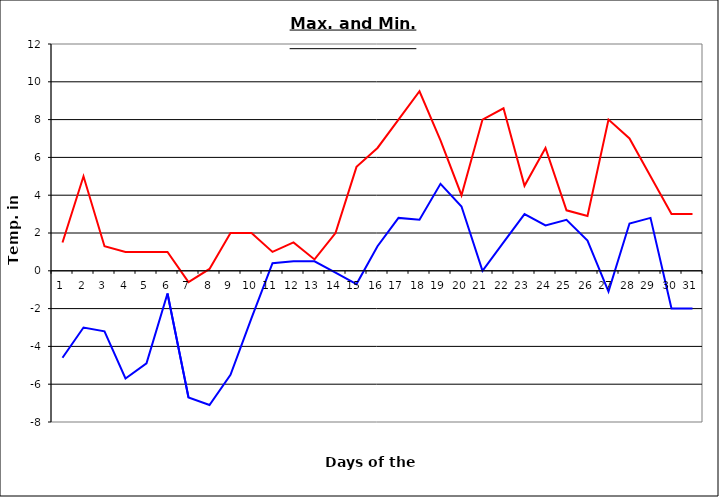
| Category | Series 0 | Series 1 |
|---|---|---|
| 0 | 1.5 | -4.6 |
| 1 | 5 | -3 |
| 2 | 1.3 | -3.2 |
| 3 | 1 | -5.7 |
| 4 | 1 | -4.9 |
| 5 | 1 | -1.2 |
| 6 | -0.6 | -6.7 |
| 7 | 0.1 | -7.1 |
| 8 | 2 | -5.5 |
| 9 | 2 | -2.5 |
| 10 | 1 | 0.4 |
| 11 | 1.5 | 0.5 |
| 12 | 0.6 | 0.5 |
| 13 | 2 | -0.1 |
| 14 | 5.5 | -0.7 |
| 15 | 6.5 | 1.3 |
| 16 | 8 | 2.8 |
| 17 | 9.5 | 2.7 |
| 18 | 6.9 | 4.6 |
| 19 | 4 | 3.4 |
| 20 | 8 | 0 |
| 21 | 8.6 | 1.5 |
| 22 | 4.5 | 3 |
| 23 | 6.5 | 2.4 |
| 24 | 3.2 | 2.7 |
| 25 | 2.9 | 1.6 |
| 26 | 8 | -1.1 |
| 27 | 7 | 2.5 |
| 28 | 5 | 2.8 |
| 29 | 3 | -2 |
| 30 | 3 | -2 |